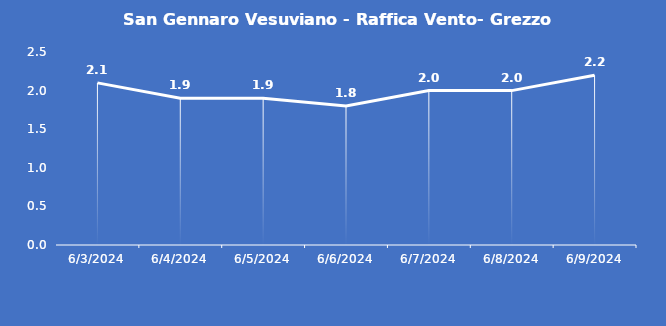
| Category | San Gennaro Vesuviano - Raffica Vento- Grezzo (m/s) |
|---|---|
| 6/3/24 | 2.1 |
| 6/4/24 | 1.9 |
| 6/5/24 | 1.9 |
| 6/6/24 | 1.8 |
| 6/7/24 | 2 |
| 6/8/24 | 2 |
| 6/9/24 | 2.2 |